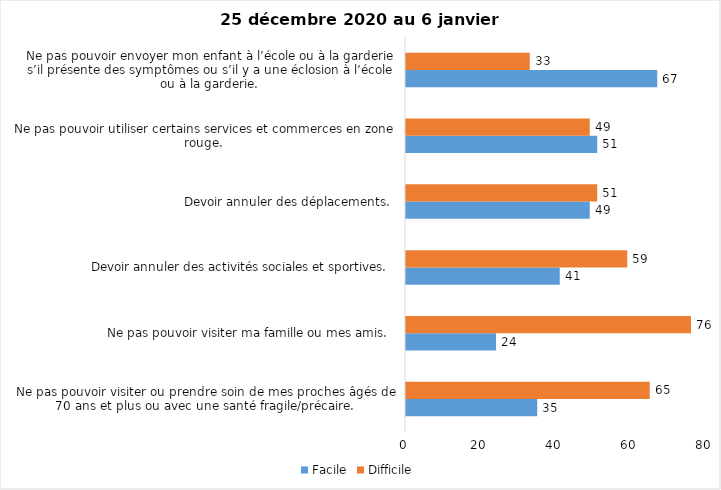
| Category | Facile | Difficile |
|---|---|---|
| Ne pas pouvoir visiter ou prendre soin de mes proches âgés de 70 ans et plus ou avec une santé fragile/précaire.  | 35 | 65 |
| Ne pas pouvoir visiter ma famille ou mes amis.  | 24 | 76 |
| Devoir annuler des activités sociales et sportives.  | 41 | 59 |
| Devoir annuler des déplacements.  | 49 | 51 |
| Ne pas pouvoir utiliser certains services et commerces en zone rouge.  | 51 | 49 |
| Ne pas pouvoir envoyer mon enfant à l’école ou à la garderie s’il présente des symptômes ou s’il y a une éclosion à l’école ou à la garderie.  | 67 | 33 |